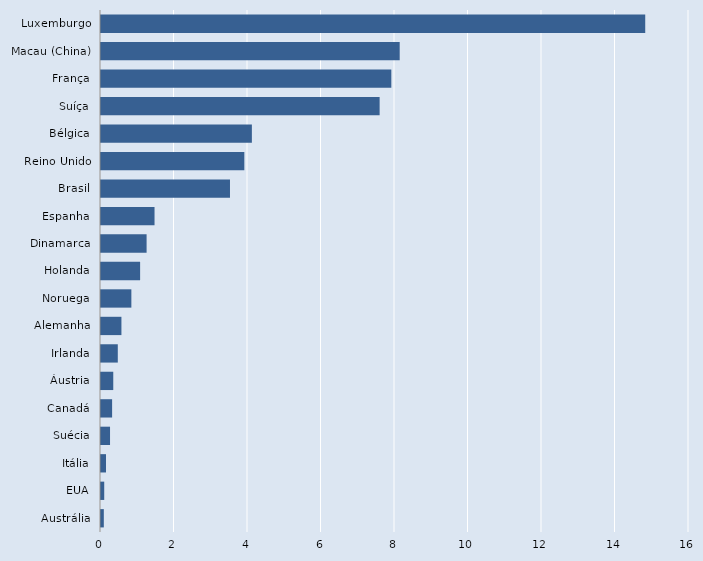
| Category | Series 0 |
|---|---|
| Austrália | 0.077 |
| EUA | 0.088 |
| Itália | 0.135 |
| Suécia | 0.246 |
| Canadá | 0.302 |
| Áustria | 0.334 |
| Irlanda | 0.457 |
| Alemanha | 0.556 |
| Noruega | 0.826 |
| Holanda | 1.064 |
| Dinamarca | 1.241 |
| Espanha | 1.457 |
| Brasil | 3.51 |
| Reino Unido | 3.9 |
| Bélgica | 4.105 |
| Suíça | 7.582 |
| França | 7.9 |
| Macau (China) | 8.128 |
| Luxemburgo | 14.809 |